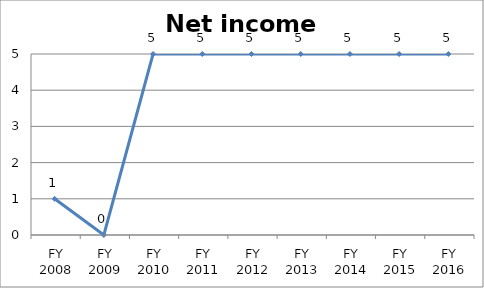
| Category | Net income score |
|---|---|
| FY 2016 | 5 |
| FY 2015 | 5 |
| FY 2014 | 5 |
| FY 2013 | 5 |
| FY 2012 | 5 |
| FY 2011 | 5 |
| FY 2010 | 5 |
| FY 2009 | 0 |
| FY 2008 | 1 |